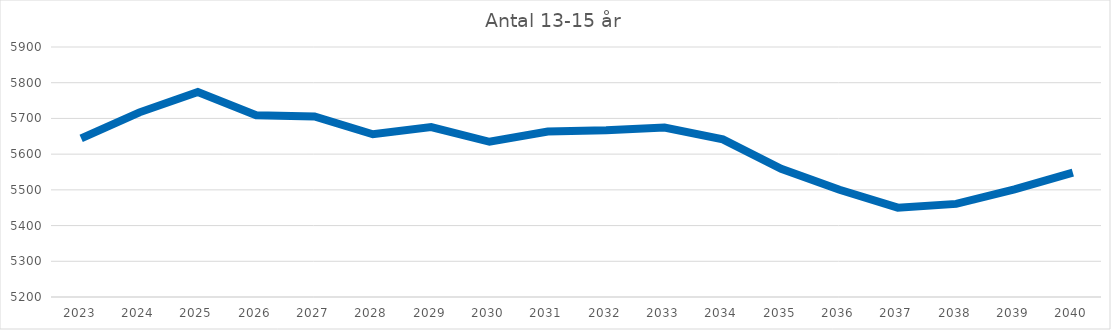
| Category | Antal 13-15 år |
|---|---|
| 2023.0 | 5644 |
| 2024.0 | 5717.029 |
| 2025.0 | 5774.171 |
| 2026.0 | 5709.153 |
| 2027.0 | 5705.305 |
| 2028.0 | 5655.785 |
| 2029.0 | 5675.9 |
| 2030.0 | 5634.684 |
| 2031.0 | 5663.164 |
| 2032.0 | 5667.017 |
| 2033.0 | 5674.549 |
| 2034.0 | 5641.289 |
| 2035.0 | 5558.999 |
| 2036.0 | 5500.142 |
| 2037.0 | 5450.133 |
| 2038.0 | 5460.667 |
| 2039.0 | 5501.201 |
| 2040.0 | 5548.45 |